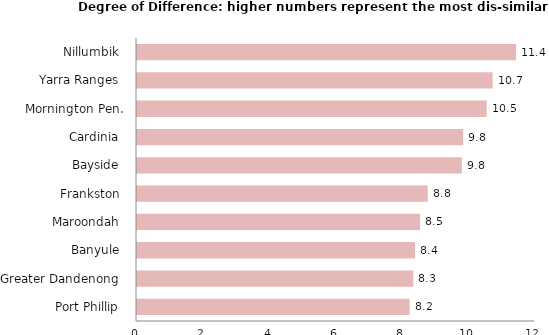
| Category | Series 0 |
|---|---|
| Port Phillip  | 8.219 |
| Greater Dandenong  | 8.331 |
| Banyule  | 8.384 |
| Maroondah  | 8.538 |
| Frankston  | 8.765 |
| Bayside  | 9.794 |
| Cardinia  | 9.833 |
| Mornington Pen. | 10.542 |
| Yarra Ranges  | 10.722 |
| Nillumbik  | 11.427 |